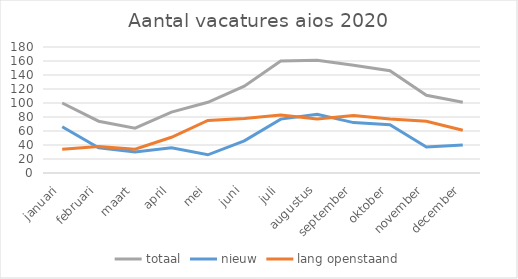
| Category | totaal | nieuw | lang openstaand |
|---|---|---|---|
| januari | 100 | 66 | 34 |
| februari | 74 | 36 | 38 |
| maart | 64 | 30 | 34 |
| april | 87 | 36 | 51 |
| mei | 101 | 26 | 75 |
| juni | 124 | 46 | 78 |
| juli | 160 | 77 | 83 |
| augustus | 161 | 84 | 77 |
| september | 154 | 72 | 82 |
| oktober | 146 | 69 | 77 |
| november | 111 | 37 | 74 |
| december | 101 | 40 | 61 |